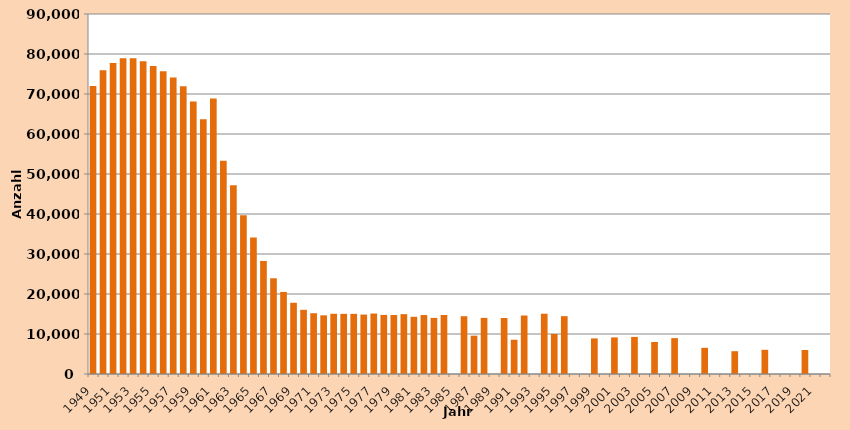
| Category | Series 1 |
|---|---|
| 1949.0 | 71997 |
| 1950.0 | 75909 |
| 1951.0 | 77754 |
| 1952.0 | 78966 |
| 1953.0 | 78919 |
| 1954.0 | 78204 |
| 1955.0 | 77020 |
| 1956.0 | 75714 |
| 1957.0 | 74097 |
| 1958.0 | 71917 |
| 1959.0 | 68126 |
| 1960.0 | 63688 |
| 1961.0 | 68858 |
| 1962.0 | 53285 |
| 1963.0 | 47202 |
| 1964.0 | 39660 |
| 1965.0 | 34144 |
| 1966.0 | 28269 |
| 1967.0 | 23928 |
| 1968.0 | 20521 |
| 1969.0 | 17803 |
| 1970.0 | 16048 |
| 1971.0 | 15197 |
| 1972.0 | 14668 |
| 1973.0 | 15053 |
| 1974.0 | 15039 |
| 1975.0 | 15035 |
| 1976.0 | 14860 |
| 1977.0 | 15115 |
| 1978.0 | 14775 |
| 1979.0 | 14747 |
| 1980.0 | 14963 |
| 1981.0 | 14300 |
| 1982.0 | 14739 |
| 1983.0 | 14023 |
| 1984.0 | 14751 |
| 1985.0 | 0 |
| 1986.0 | 14446 |
| 1987.0 | 9579 |
| 1988.0 | 14029 |
| 1989.0 | 0 |
| 1990.0 | 13995 |
| 1991.0 | 8563 |
| 1992.0 | 14621 |
| 1993.0 | 0 |
| 1994.0 | 15069 |
| 1995.0 | 10004 |
| 1996.0 | 14459 |
| 1997.0 | 0 |
| 1998.0 | 0 |
| 1999.0 | 8898 |
| 2000.0 | 0 |
| 2001.0 | 9149 |
| 2002.0 | 0 |
| 2003.0 | 9274 |
| 2004.0 | 0 |
| 2005.0 | 8000 |
| 2006.0 | 0 |
| 2007.0 | 8968 |
| 2008.0 | 0 |
| 2009.0 | 0 |
| 2010.0 | 6548 |
| 2011.0 | 0 |
| 2012.0 | 0 |
| 2013.0 | 5700 |
| 2014.0 | 0 |
| 2015.0 | 0 |
| 2016.0 | 6049 |
| 2017.0 | 0 |
| 2018.0 | 0 |
| 2019.0 | 0 |
| 2020.0 | 5996 |
| 2021.0 | 0 |
| 2022.0 | 0 |